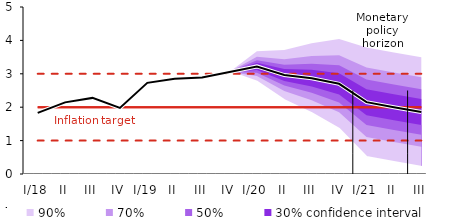
| Category | Inflation Target | Inflation Target - lower bound | Inflation Target - upper bound | linka | Střed předpovědi |
|---|---|---|---|---|---|
| I/18 | 2 | 1 | 3 | 1.831 | 1.831 |
| II | 2 | 1 | 3 | 2.145 | 2.145 |
| III | 2 | 1 | 3 | 2.279 | 2.279 |
| IV | 2 | 1 | 3 | 1.979 | 1.979 |
| I/19 | 2 | 1 | 3 | 2.73 | 2.73 |
| II | 2 | 1 | 3 | 2.855 | 2.855 |
| III | 2 | 1 | 3 | 2.888 | 2.888 |
| IV | 2 | 1 | 3 | 3.055 | 3.055 |
| I/20 | 2 | 1 | 3 | 3.221 | 3.221 |
| II | 2 | 1 | 3 | 2.962 | 2.962 |
| III | 2 | 1 | 3 | 2.869 | 2.869 |
| IV | 2 | 1 | 3 | 2.7 | 2.7 |
| I/21 | 2 | 1 | 3 | 2.151 | 2.151 |
| II | 2 | 1 | 3 | 1.997 | 1.997 |
| III | 2 | 1 | 3 | 1.855 | 1.855 |